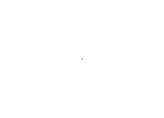
| Category | Series 0 |
|---|---|
| Available | 3307 |
| Picked | 0 |